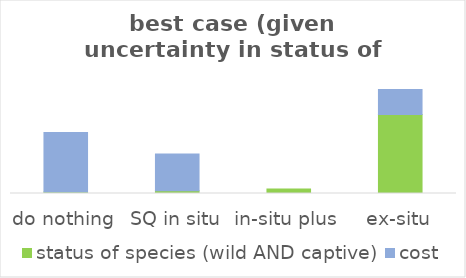
| Category | status of species (wild AND captive) | cost |
|---|---|---|
| do nothing | 0.009 | 0.394 |
| SQ in situ | 0.019 | 0.243 |
| in-situ plus | 0.03 | 0 |
| ex-situ | 0.522 | 0.165 |